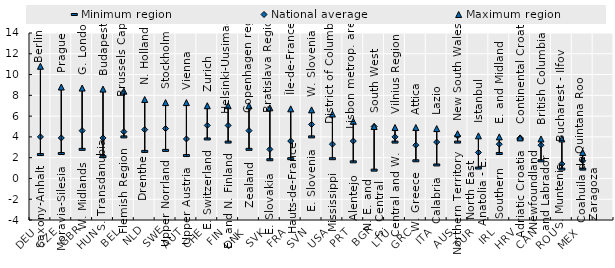
| Category | Minimum region | National average | Maximum region |
|---|---|---|---|
| DEU | 2.3 | 4 | 10.8 |
| CZE | 2.4 | 3.9 | 8.8 |
| GBR | 2.8 | 4.6 | 8.7 |
| HUN | 2.1 | 3.9 | 8.6 |
| BEL | 4 | 4.5 | 8.4 |
| NLD | 2.6 | 4.7 | 7.6 |
| SWE | 2.7 | 4.8 | 7.3 |
| AUT | 2.2 | 3.8 | 7.3 |
| CHE | 3.8 | 5.1 | 7 |
| FIN | 3.5 | 5.1 | 7 |
| DNK | 2.8 | 4.6 | 7 |
| SVK | 1.8 | 2.8 | 6.8 |
| FRA | 1.9 | 3.6 | 6.7 |
| SVN | 4 | 5.2 | 6.6 |
| USA | 1.9 | 3.3 | 6.2 |
| PRT | 1.6 | 3.6 | 5.5 |
| BGR | 0.8 | 5 | 5 |
| LTU | 3.5 | 4 | 4.9 |
| GRC | 1.7 | 3.2 | 4.9 |
| ITA | 1.3 | 3.5 | 4.8 |
| AUS | 3.5 | 4.1 | 4.3 |
| TUR | 1 | 2.5 | 4.1 |
| IRL | 2.4 | 3.3 | 4 |
| HRV | 3.8 | 3.9 | 3.9 |
| CAN | 1.7 | 3.2 | 3.8 |
| ROU | 0.9 | 1.4 | 3.8 |
| MEX | 0.9 | 1.7 | 2.5 |